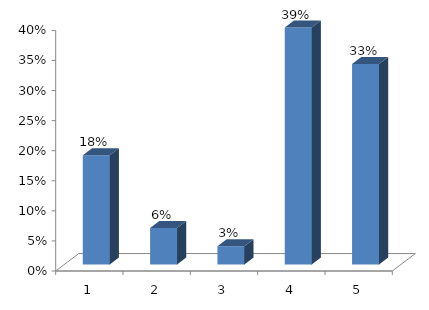
| Category | Series 0 |
|---|---|
| 0 | 0.182 |
| 1 | 0.061 |
| 2 | 0.03 |
| 3 | 0.394 |
| 4 | 0.333 |